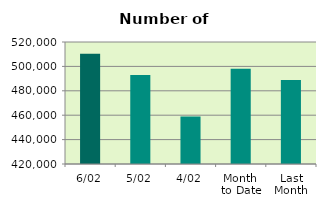
| Category | Series 0 |
|---|---|
| 6/02 | 510344 |
| 5/02 | 492994 |
| 4/02 | 458940 |
| Month 
to Date | 498070.5 |
| Last
Month | 488780.727 |